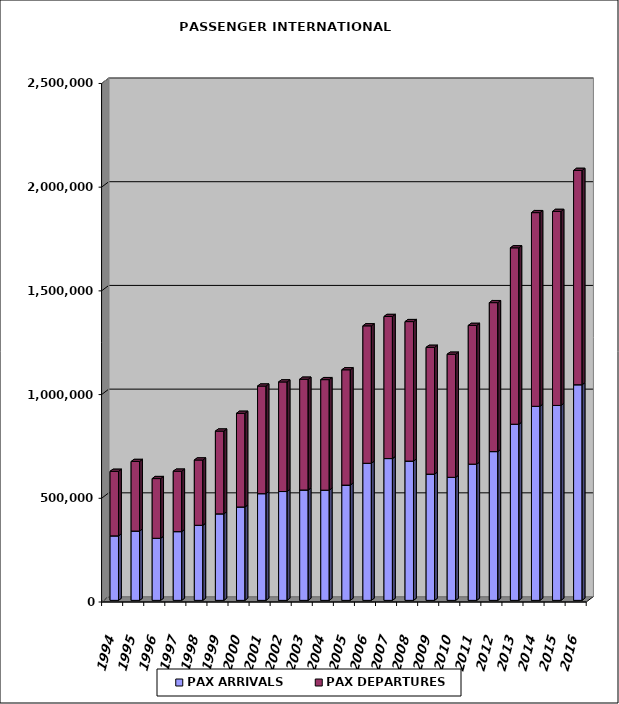
| Category | PAX ARRIVALS | PAX DEPARTURES |
|---|---|---|
| 1994.0 | 311007 | 310979 |
| 1995.0 | 334118 | 335398 |
| 1996.0 | 299346 | 287760 |
| 1997.0 | 331475 | 291214 |
| 1998.0 | 362033 | 314654 |
| 1999.0 | 417136 | 398909 |
| 2000.0 | 450258 | 451452 |
| 2001.0 | 514495 | 518623 |
| 2002.0 | 524740 | 528318 |
| 2003.0 | 532208 | 533904 |
| 2004.0 | 531277 | 532876 |
| 2005.0 | 555647 | 555981 |
| 2006.0 | 660904 | 662652 |
| 2007.0 | 683669 | 684847 |
| 2008.0 | 671477 | 672446 |
| 2009.0 | 608693 | 611086 |
| 2010.0 | 593228 | 593357 |
| 2011.0 | 656791 | 668706 |
| 2012.0 | 717249 | 718064 |
| 2013.0 | 849271 | 850306 |
| 2014.0 | 935615 | 933665 |
| 2015.0 | 939794 | 935299 |
| 2016.0 | 1039616 | 1033246 |